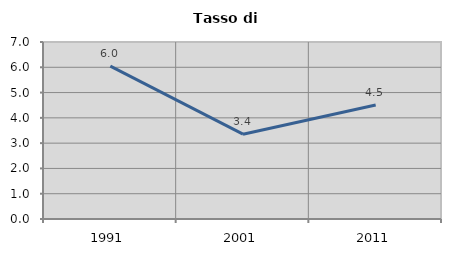
| Category | Tasso di disoccupazione   |
|---|---|
| 1991.0 | 6.045 |
| 2001.0 | 3.355 |
| 2011.0 | 4.509 |